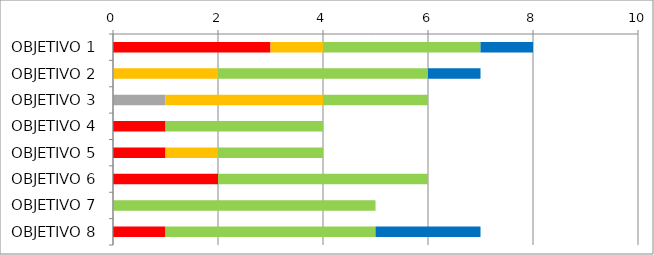
| Category | Series 0 | Series 1 | Series 2 | Series 3 | Series 4 | Series 5 |
|---|---|---|---|---|---|---|
| OBJETIVO 1 | 0 | 0 | 3 | 1 | 3 | 1 |
| OBJETIVO 2 | 0 | 0 | 0 | 2 | 4 | 1 |
| OBJETIVO 3 | 0 | 1 | 0 | 3 | 2 | 0 |
| OBJETIVO 4 | 0 | 0 | 1 | 0 | 3 | 0 |
| OBJETIVO 5 | 0 | 0 | 1 | 1 | 2 | 0 |
| OBJETIVO 6 | 0 | 0 | 2 | 0 | 4 | 0 |
| OBJETIVO 7 | 0 | 0 | 0 | 0 | 5 | 0 |
| OBJETIVO 8 | 0 | 0 | 1 | 0 | 4 | 2 |